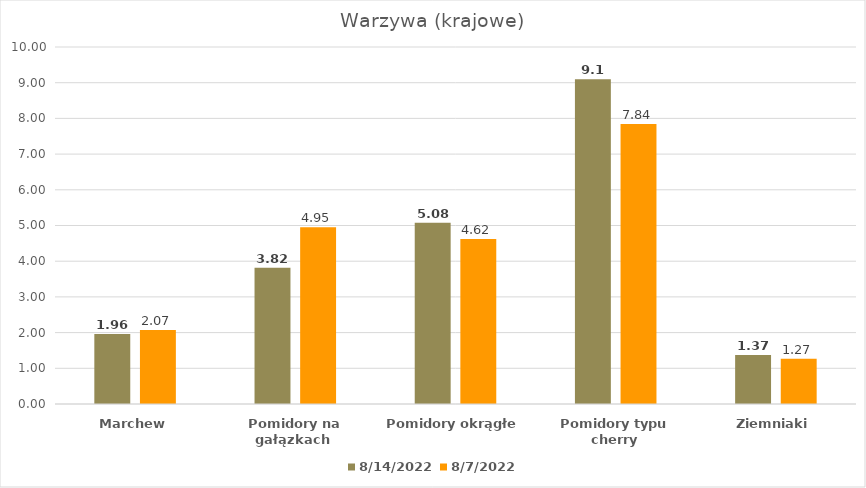
| Category | 2022-08-14 | 2022-08-07 |
|---|---|---|
| Marchew | 1.96 | 2.07 |
| Pomidory na gałązkach  | 3.82 | 4.95 |
| Pomidory okrągłe | 5.08 | 4.62 |
| Pomidory typu cherry | 9.1 | 7.84 |
| Ziemniaki | 1.37 | 1.27 |